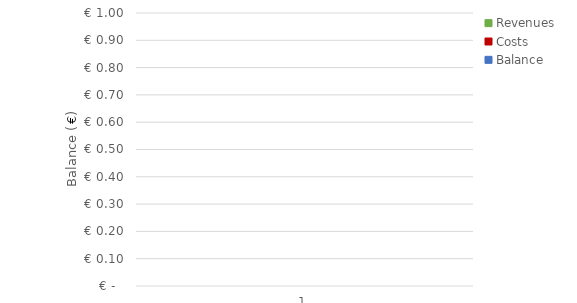
| Category | Revenues | Costs | Balance |
|---|---|---|---|
| 0 | 0 | 0 | 0 |